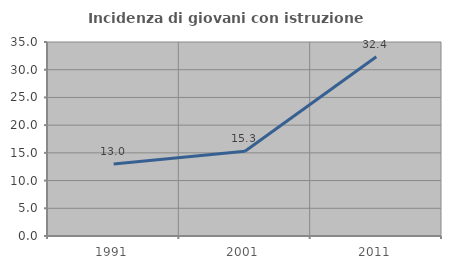
| Category | Incidenza di giovani con istruzione universitaria |
|---|---|
| 1991.0 | 12.987 |
| 2001.0 | 15.278 |
| 2011.0 | 32.353 |